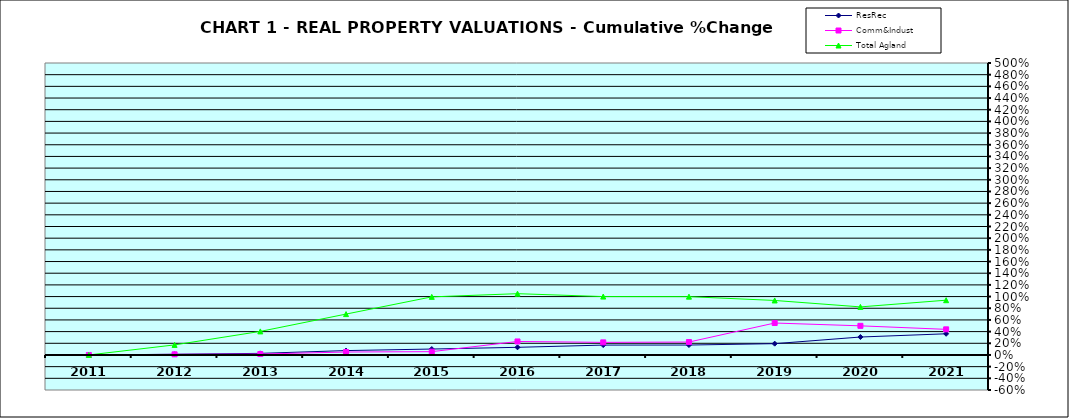
| Category | ResRec | Comm&Indust | Total Agland |
|---|---|---|---|
| 2011.0 | 0 | 0 | 0 |
| 2012.0 | 0.012 | 0.011 | 0.172 |
| 2013.0 | 0.027 | 0.016 | 0.403 |
| 2014.0 | 0.075 | 0.051 | 0.7 |
| 2015.0 | 0.101 | 0.057 | 0.995 |
| 2016.0 | 0.131 | 0.231 | 1.05 |
| 2017.0 | 0.169 | 0.216 | 1 |
| 2018.0 | 0.17 | 0.221 | 0.999 |
| 2019.0 | 0.194 | 0.547 | 0.933 |
| 2020.0 | 0.307 | 0.499 | 0.823 |
| 2021.0 | 0.363 | 0.439 | 0.938 |